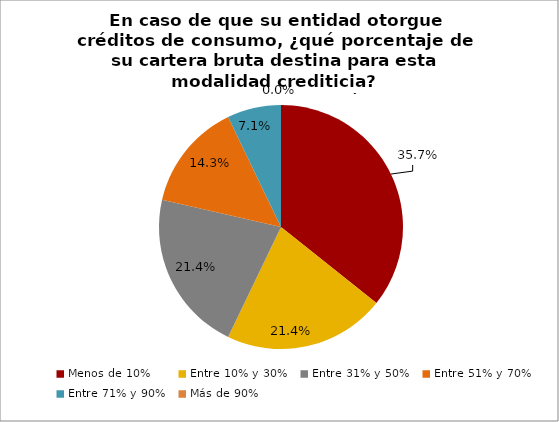
| Category | En caso de que su entidad otorgue créditos de consumo, ¿qué porcentaje de su cartera bruta destina para esta modalidad crediticia? Mercado de microcrédito |
|---|---|
| Menos de 10% | 0.357 |
| Entre 10% y 30% | 0.214 |
| Entre 31% y 50% | 0.214 |
| Entre 51% y 70% | 0.143 |
| Entre 71% y 90% | 0.071 |
| Más de 90% | 0 |